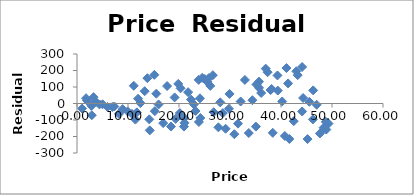
| Category | Series 0 |
|---|---|
| 1.0 | -30.679 |
| 1.7721277707126588 | 31.987 |
| 1.9585093962766742 | 17.972 |
| 2.8313064988848318 | -14.158 |
| 2.9027415075817804 | -71.006 |
| 3.2467590622821634 | 38.523 |
| 3.715613060032769 | 9.94 |
| 4.414745251841259 | -5.837 |
| 5.014150714508328 | -4.79 |
| 5.980190490363254 | -20.642 |
| 6.929938560319105 | -21.058 |
| 7.318303283917859 | -18.115 |
| 8.230176090835677 | -63.053 |
| 8.953284496885392 | -34.156 |
| 9.93135475690074 | -47.869 |
| 10.77988163045602 | -62.753 |
| 11.132024017224099 | 107.375 |
| 11.444996358568313 | -97.513 |
| 11.734721377834083 | -53.748 |
| 11.974336770351202 | 28.937 |
| 12.430509982365422 | 2.418 |
| 13.271342097442291 | 74.625 |
| 13.798327160439607 | 153.445 |
| 14.175422173075109 | -96.078 |
| 14.266122671433783 | -162.779 |
| 15.17207143975984 | 173.7 |
| 15.257181445256426 | -46.552 |
| 15.551763010002563 | 59.504 |
| 15.993707190730474 | -5.737 |
| 16.89582713176302 | -119.016 |
| 17.666315599654947 | 105.676 |
| 18.428895358195945 | -139.311 |
| 19.143173688158008 | 36.871 |
| 19.347071805664836 | -93.434 |
| 19.85175039286341 | 118.735 |
| 20.161901068949092 | -57.864 |
| 20.310137608698632 | 92.082 |
| 20.970563700874596 | -139.898 |
| 21.029285700074063 | -88.464 |
| 21.075669627206246 | -117.241 |
| 21.792897848781617 | 68.705 |
| 22.36166243737641 | 23.405 |
| 22.91376866209962 | -4.978 |
| 23.242318180036882 | -45.192 |
| 23.85465904271913 | 143.073 |
| 23.90324614378775 | -111.852 |
| 24.103996666662397 | 31.355 |
| 24.17780104567195 | -87.776 |
| 24.552404243290617 | 155.656 |
| 25.042521134504366 | 148.551 |
| 25.59091129088352 | 131.034 |
| 25.852239902993784 | 153.847 |
| 26.13632424601183 | 106.783 |
| 26.633505446200036 | 171.604 |
| 26.799239564593535 | -52.66 |
| 27.72100595651242 | -144.5 |
| 28.086209797806212 | 7.012 |
| 28.58346742046228 | -58.322 |
| 29.13523869315873 | -152.998 |
| 29.796085279339973 | -32.056 |
| 29.91371295084885 | 58.082 |
| 30.854100645917526 | -185.999 |
| 31.575700601830953 | -122.03 |
| 32.08975863740304 | 12.128 |
| 32.9218838065499 | 142.959 |
| 33.68071644831483 | -178.967 |
| 34.39587243990781 | 19.986 |
| 35.07512698745129 | -139.985 |
| 35.175888897001705 | 115.251 |
| 35.68523523755617 | 132.632 |
| 35.696449406769354 | 95.006 |
| 36.12051395611863 | 63.673 |
| 37.00131746195319 | 211.096 |
| 37.37125790555555 | 189.642 |
| 37.952296038601695 | 81.45 |
| 38.16727649800819 | 87.883 |
| 38.38898186264048 | -177.645 |
| 39.30199857954961 | 170.066 |
| 39.36805231327567 | 78.436 |
| 40.23305502824163 | 12.419 |
| 40.747618388267064 | -196.811 |
| 41.074359924101444 | 214.804 |
| 41.38828071876815 | 121.763 |
| 41.634994234719784 | -215.003 |
| 42.50839470024612 | -107.108 |
| 43.01493230229939 | 195.306 |
| 43.27231064078972 | 171.987 |
| 44.139965872345485 | 221.435 |
| 44.147630171453415 | -48.366 |
| 44.3361979836301 | 33.382 |
| 45.206436210408086 | -215.618 |
| 45.56132472658592 | 10.302 |
| 46.25663536286757 | -96.123 |
| 46.303721712112306 | 79.566 |
| 46.98862397483953 | -7.619 |
| 47.63422906661138 | -181.633 |
| 48.35007689117924 | -146.665 |
| 48.77760881966801 | -110.889 |
| 48.883386525271185 | -157.958 |
| 49.314056764968704 | -121.56 |